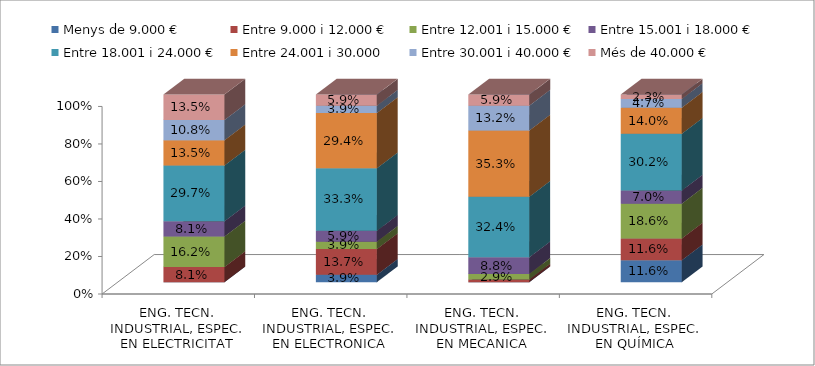
| Category | Menys de 9.000 € | Entre 9.000 i 12.000 € | Entre 12.001 i 15.000 € | Entre 15.001 i 18.000 € | Entre 18.001 i 24.000 € | Entre 24.001 i 30.000 | Entre 30.001 i 40.000 € | Més de 40.000 € |
|---|---|---|---|---|---|---|---|---|
| ENG. TECN. INDUSTRIAL, ESPEC. EN ELECTRICITAT | 0 | 0.081 | 0.162 | 0.081 | 0.297 | 0.135 | 0.108 | 0.135 |
| ENG. TECN. INDUSTRIAL, ESPEC. EN ELECTRONICA INDUSTRIAL | 0.039 | 0.137 | 0.039 | 0.059 | 0.333 | 0.294 | 0.039 | 0.059 |
| ENG. TECN. INDUSTRIAL, ESPEC. EN MECANICA | 0 | 0.015 | 0.029 | 0.088 | 0.324 | 0.353 | 0.132 | 0.059 |
| ENG. TECN. INDUSTRIAL, ESPEC. EN QUÍMICA INDUSTRIAL | 0.116 | 0.116 | 0.186 | 0.07 | 0.302 | 0.14 | 0.047 | 0.023 |